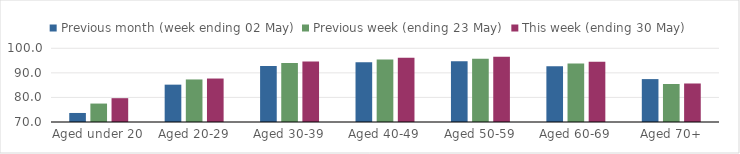
| Category | Previous month (week ending 02 May) | Previous week (ending 23 May) | This week (ending 30 May) |
|---|---|---|---|
| Aged under 20 | 73.677 | 77.505 | 79.694 |
| Aged 20-29 | 85.199 | 87.314 | 87.692 |
| Aged 30-39 | 92.822 | 93.995 | 94.582 |
| Aged 40-49 | 94.345 | 95.442 | 96.165 |
| Aged 50-59 | 94.718 | 95.695 | 96.519 |
| Aged 60-69 | 92.647 | 93.804 | 94.473 |
| Aged 70+ | 87.459 | 85.474 | 85.673 |